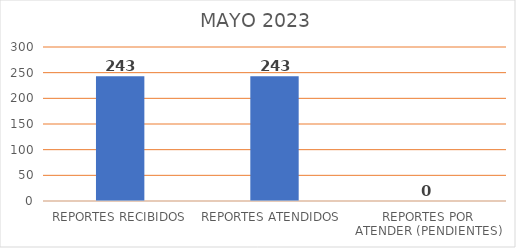
| Category | Series 0 |
|---|---|
| REPORTES RECIBIDOS | 243 |
| REPORTES ATENDIDOS  | 243 |
| REPORTES POR ATENDER (PENDIENTES) | 0 |